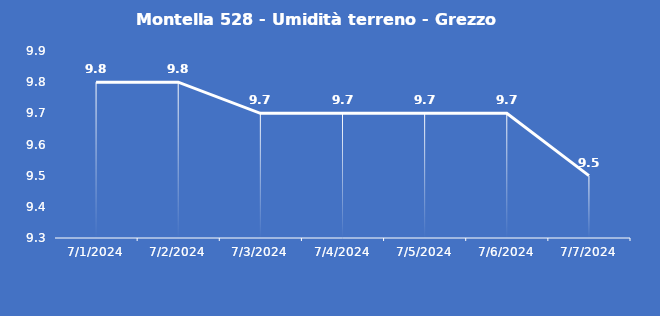
| Category | Montella 528 - Umidità terreno - Grezzo (%VWC) |
|---|---|
| 7/1/24 | 9.8 |
| 7/2/24 | 9.8 |
| 7/3/24 | 9.7 |
| 7/4/24 | 9.7 |
| 7/5/24 | 9.7 |
| 7/6/24 | 9.7 |
| 7/7/24 | 9.5 |